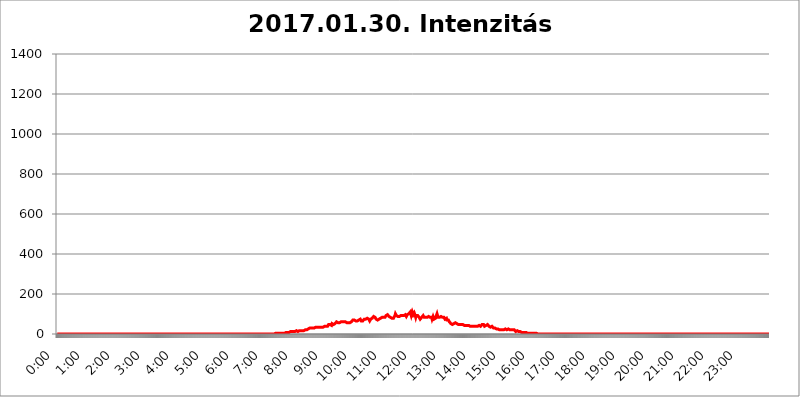
| Category | 2017.01.30. Intenzitás [W/m^2] |
|---|---|
| 0.0 | 0 |
| 0.0006944444444444445 | 0 |
| 0.001388888888888889 | 0 |
| 0.0020833333333333333 | 0 |
| 0.002777777777777778 | 0 |
| 0.003472222222222222 | 0 |
| 0.004166666666666667 | 0 |
| 0.004861111111111111 | 0 |
| 0.005555555555555556 | 0 |
| 0.0062499999999999995 | 0 |
| 0.006944444444444444 | 0 |
| 0.007638888888888889 | 0 |
| 0.008333333333333333 | 0 |
| 0.009027777777777779 | 0 |
| 0.009722222222222222 | 0 |
| 0.010416666666666666 | 0 |
| 0.011111111111111112 | 0 |
| 0.011805555555555555 | 0 |
| 0.012499999999999999 | 0 |
| 0.013194444444444444 | 0 |
| 0.013888888888888888 | 0 |
| 0.014583333333333332 | 0 |
| 0.015277777777777777 | 0 |
| 0.015972222222222224 | 0 |
| 0.016666666666666666 | 0 |
| 0.017361111111111112 | 0 |
| 0.018055555555555557 | 0 |
| 0.01875 | 0 |
| 0.019444444444444445 | 0 |
| 0.02013888888888889 | 0 |
| 0.020833333333333332 | 0 |
| 0.02152777777777778 | 0 |
| 0.022222222222222223 | 0 |
| 0.02291666666666667 | 0 |
| 0.02361111111111111 | 0 |
| 0.024305555555555556 | 0 |
| 0.024999999999999998 | 0 |
| 0.025694444444444447 | 0 |
| 0.02638888888888889 | 0 |
| 0.027083333333333334 | 0 |
| 0.027777777777777776 | 0 |
| 0.02847222222222222 | 0 |
| 0.029166666666666664 | 0 |
| 0.029861111111111113 | 0 |
| 0.030555555555555555 | 0 |
| 0.03125 | 0 |
| 0.03194444444444445 | 0 |
| 0.03263888888888889 | 0 |
| 0.03333333333333333 | 0 |
| 0.034027777777777775 | 0 |
| 0.034722222222222224 | 0 |
| 0.035416666666666666 | 0 |
| 0.036111111111111115 | 0 |
| 0.03680555555555556 | 0 |
| 0.0375 | 0 |
| 0.03819444444444444 | 0 |
| 0.03888888888888889 | 0 |
| 0.03958333333333333 | 0 |
| 0.04027777777777778 | 0 |
| 0.04097222222222222 | 0 |
| 0.041666666666666664 | 0 |
| 0.042361111111111106 | 0 |
| 0.04305555555555556 | 0 |
| 0.043750000000000004 | 0 |
| 0.044444444444444446 | 0 |
| 0.04513888888888889 | 0 |
| 0.04583333333333334 | 0 |
| 0.04652777777777778 | 0 |
| 0.04722222222222222 | 0 |
| 0.04791666666666666 | 0 |
| 0.04861111111111111 | 0 |
| 0.049305555555555554 | 0 |
| 0.049999999999999996 | 0 |
| 0.05069444444444445 | 0 |
| 0.051388888888888894 | 0 |
| 0.052083333333333336 | 0 |
| 0.05277777777777778 | 0 |
| 0.05347222222222222 | 0 |
| 0.05416666666666667 | 0 |
| 0.05486111111111111 | 0 |
| 0.05555555555555555 | 0 |
| 0.05625 | 0 |
| 0.05694444444444444 | 0 |
| 0.057638888888888885 | 0 |
| 0.05833333333333333 | 0 |
| 0.05902777777777778 | 0 |
| 0.059722222222222225 | 0 |
| 0.06041666666666667 | 0 |
| 0.061111111111111116 | 0 |
| 0.06180555555555556 | 0 |
| 0.0625 | 0 |
| 0.06319444444444444 | 0 |
| 0.06388888888888888 | 0 |
| 0.06458333333333334 | 0 |
| 0.06527777777777778 | 0 |
| 0.06597222222222222 | 0 |
| 0.06666666666666667 | 0 |
| 0.06736111111111111 | 0 |
| 0.06805555555555555 | 0 |
| 0.06874999999999999 | 0 |
| 0.06944444444444443 | 0 |
| 0.07013888888888889 | 0 |
| 0.07083333333333333 | 0 |
| 0.07152777777777779 | 0 |
| 0.07222222222222223 | 0 |
| 0.07291666666666667 | 0 |
| 0.07361111111111111 | 0 |
| 0.07430555555555556 | 0 |
| 0.075 | 0 |
| 0.07569444444444444 | 0 |
| 0.0763888888888889 | 0 |
| 0.07708333333333334 | 0 |
| 0.07777777777777778 | 0 |
| 0.07847222222222222 | 0 |
| 0.07916666666666666 | 0 |
| 0.0798611111111111 | 0 |
| 0.08055555555555556 | 0 |
| 0.08125 | 0 |
| 0.08194444444444444 | 0 |
| 0.08263888888888889 | 0 |
| 0.08333333333333333 | 0 |
| 0.08402777777777777 | 0 |
| 0.08472222222222221 | 0 |
| 0.08541666666666665 | 0 |
| 0.08611111111111112 | 0 |
| 0.08680555555555557 | 0 |
| 0.08750000000000001 | 0 |
| 0.08819444444444445 | 0 |
| 0.08888888888888889 | 0 |
| 0.08958333333333333 | 0 |
| 0.09027777777777778 | 0 |
| 0.09097222222222222 | 0 |
| 0.09166666666666667 | 0 |
| 0.09236111111111112 | 0 |
| 0.09305555555555556 | 0 |
| 0.09375 | 0 |
| 0.09444444444444444 | 0 |
| 0.09513888888888888 | 0 |
| 0.09583333333333333 | 0 |
| 0.09652777777777777 | 0 |
| 0.09722222222222222 | 0 |
| 0.09791666666666667 | 0 |
| 0.09861111111111111 | 0 |
| 0.09930555555555555 | 0 |
| 0.09999999999999999 | 0 |
| 0.10069444444444443 | 0 |
| 0.1013888888888889 | 0 |
| 0.10208333333333335 | 0 |
| 0.10277777777777779 | 0 |
| 0.10347222222222223 | 0 |
| 0.10416666666666667 | 0 |
| 0.10486111111111111 | 0 |
| 0.10555555555555556 | 0 |
| 0.10625 | 0 |
| 0.10694444444444444 | 0 |
| 0.1076388888888889 | 0 |
| 0.10833333333333334 | 0 |
| 0.10902777777777778 | 0 |
| 0.10972222222222222 | 0 |
| 0.1111111111111111 | 0 |
| 0.11180555555555556 | 0 |
| 0.11180555555555556 | 0 |
| 0.1125 | 0 |
| 0.11319444444444444 | 0 |
| 0.11388888888888889 | 0 |
| 0.11458333333333333 | 0 |
| 0.11527777777777777 | 0 |
| 0.11597222222222221 | 0 |
| 0.11666666666666665 | 0 |
| 0.1173611111111111 | 0 |
| 0.11805555555555557 | 0 |
| 0.11944444444444445 | 0 |
| 0.12013888888888889 | 0 |
| 0.12083333333333333 | 0 |
| 0.12152777777777778 | 0 |
| 0.12222222222222223 | 0 |
| 0.12291666666666667 | 0 |
| 0.12291666666666667 | 0 |
| 0.12361111111111112 | 0 |
| 0.12430555555555556 | 0 |
| 0.125 | 0 |
| 0.12569444444444444 | 0 |
| 0.12638888888888888 | 0 |
| 0.12708333333333333 | 0 |
| 0.16875 | 0 |
| 0.12847222222222224 | 0 |
| 0.12916666666666668 | 0 |
| 0.12986111111111112 | 0 |
| 0.13055555555555556 | 0 |
| 0.13125 | 0 |
| 0.13194444444444445 | 0 |
| 0.1326388888888889 | 0 |
| 0.13333333333333333 | 0 |
| 0.13402777777777777 | 0 |
| 0.13402777777777777 | 0 |
| 0.13472222222222222 | 0 |
| 0.13541666666666666 | 0 |
| 0.1361111111111111 | 0 |
| 0.13749999999999998 | 0 |
| 0.13819444444444443 | 0 |
| 0.1388888888888889 | 0 |
| 0.13958333333333334 | 0 |
| 0.14027777777777778 | 0 |
| 0.14097222222222222 | 0 |
| 0.14166666666666666 | 0 |
| 0.1423611111111111 | 0 |
| 0.14305555555555557 | 0 |
| 0.14375000000000002 | 0 |
| 0.14444444444444446 | 0 |
| 0.1451388888888889 | 0 |
| 0.1451388888888889 | 0 |
| 0.14652777777777778 | 0 |
| 0.14722222222222223 | 0 |
| 0.14791666666666667 | 0 |
| 0.1486111111111111 | 0 |
| 0.14930555555555555 | 0 |
| 0.15 | 0 |
| 0.15069444444444444 | 0 |
| 0.15138888888888888 | 0 |
| 0.15208333333333332 | 0 |
| 0.15277777777777776 | 0 |
| 0.15347222222222223 | 0 |
| 0.15416666666666667 | 0 |
| 0.15486111111111112 | 0 |
| 0.15555555555555556 | 0 |
| 0.15625 | 0 |
| 0.15694444444444444 | 0 |
| 0.15763888888888888 | 0 |
| 0.15833333333333333 | 0 |
| 0.15902777777777777 | 0 |
| 0.15972222222222224 | 0 |
| 0.16041666666666668 | 0 |
| 0.16111111111111112 | 0 |
| 0.16180555555555556 | 0 |
| 0.1625 | 0 |
| 0.16319444444444445 | 0 |
| 0.1638888888888889 | 0 |
| 0.16458333333333333 | 0 |
| 0.16527777777777777 | 0 |
| 0.16597222222222222 | 0 |
| 0.16666666666666666 | 0 |
| 0.1673611111111111 | 0 |
| 0.16805555555555554 | 0 |
| 0.16874999999999998 | 0 |
| 0.16944444444444443 | 0 |
| 0.17013888888888887 | 0 |
| 0.1708333333333333 | 0 |
| 0.17152777777777775 | 0 |
| 0.17222222222222225 | 0 |
| 0.1729166666666667 | 0 |
| 0.17361111111111113 | 0 |
| 0.17430555555555557 | 0 |
| 0.17500000000000002 | 0 |
| 0.17569444444444446 | 0 |
| 0.1763888888888889 | 0 |
| 0.17708333333333334 | 0 |
| 0.17777777777777778 | 0 |
| 0.17847222222222223 | 0 |
| 0.17916666666666667 | 0 |
| 0.1798611111111111 | 0 |
| 0.18055555555555555 | 0 |
| 0.18125 | 0 |
| 0.18194444444444444 | 0 |
| 0.1826388888888889 | 0 |
| 0.18333333333333335 | 0 |
| 0.1840277777777778 | 0 |
| 0.18472222222222223 | 0 |
| 0.18541666666666667 | 0 |
| 0.18611111111111112 | 0 |
| 0.18680555555555556 | 0 |
| 0.1875 | 0 |
| 0.18819444444444444 | 0 |
| 0.18888888888888888 | 0 |
| 0.18958333333333333 | 0 |
| 0.19027777777777777 | 0 |
| 0.1909722222222222 | 0 |
| 0.19166666666666665 | 0 |
| 0.19236111111111112 | 0 |
| 0.19305555555555554 | 0 |
| 0.19375 | 0 |
| 0.19444444444444445 | 0 |
| 0.1951388888888889 | 0 |
| 0.19583333333333333 | 0 |
| 0.19652777777777777 | 0 |
| 0.19722222222222222 | 0 |
| 0.19791666666666666 | 0 |
| 0.1986111111111111 | 0 |
| 0.19930555555555554 | 0 |
| 0.19999999999999998 | 0 |
| 0.20069444444444443 | 0 |
| 0.20138888888888887 | 0 |
| 0.2020833333333333 | 0 |
| 0.2027777777777778 | 0 |
| 0.2034722222222222 | 0 |
| 0.2041666666666667 | 0 |
| 0.20486111111111113 | 0 |
| 0.20555555555555557 | 0 |
| 0.20625000000000002 | 0 |
| 0.20694444444444446 | 0 |
| 0.2076388888888889 | 0 |
| 0.20833333333333334 | 0 |
| 0.20902777777777778 | 0 |
| 0.20972222222222223 | 0 |
| 0.21041666666666667 | 0 |
| 0.2111111111111111 | 0 |
| 0.21180555555555555 | 0 |
| 0.2125 | 0 |
| 0.21319444444444444 | 0 |
| 0.2138888888888889 | 0 |
| 0.21458333333333335 | 0 |
| 0.2152777777777778 | 0 |
| 0.21597222222222223 | 0 |
| 0.21666666666666667 | 0 |
| 0.21736111111111112 | 0 |
| 0.21805555555555556 | 0 |
| 0.21875 | 0 |
| 0.21944444444444444 | 0 |
| 0.22013888888888888 | 0 |
| 0.22083333333333333 | 0 |
| 0.22152777777777777 | 0 |
| 0.2222222222222222 | 0 |
| 0.22291666666666665 | 0 |
| 0.2236111111111111 | 0 |
| 0.22430555555555556 | 0 |
| 0.225 | 0 |
| 0.22569444444444445 | 0 |
| 0.2263888888888889 | 0 |
| 0.22708333333333333 | 0 |
| 0.22777777777777777 | 0 |
| 0.22847222222222222 | 0 |
| 0.22916666666666666 | 0 |
| 0.2298611111111111 | 0 |
| 0.23055555555555554 | 0 |
| 0.23124999999999998 | 0 |
| 0.23194444444444443 | 0 |
| 0.23263888888888887 | 0 |
| 0.2333333333333333 | 0 |
| 0.2340277777777778 | 0 |
| 0.2347222222222222 | 0 |
| 0.2354166666666667 | 0 |
| 0.23611111111111113 | 0 |
| 0.23680555555555557 | 0 |
| 0.23750000000000002 | 0 |
| 0.23819444444444446 | 0 |
| 0.2388888888888889 | 0 |
| 0.23958333333333334 | 0 |
| 0.24027777777777778 | 0 |
| 0.24097222222222223 | 0 |
| 0.24166666666666667 | 0 |
| 0.2423611111111111 | 0 |
| 0.24305555555555555 | 0 |
| 0.24375 | 0 |
| 0.24444444444444446 | 0 |
| 0.24513888888888888 | 0 |
| 0.24583333333333335 | 0 |
| 0.2465277777777778 | 0 |
| 0.24722222222222223 | 0 |
| 0.24791666666666667 | 0 |
| 0.24861111111111112 | 0 |
| 0.24930555555555556 | 0 |
| 0.25 | 0 |
| 0.25069444444444444 | 0 |
| 0.2513888888888889 | 0 |
| 0.2520833333333333 | 0 |
| 0.25277777777777777 | 0 |
| 0.2534722222222222 | 0 |
| 0.25416666666666665 | 0 |
| 0.2548611111111111 | 0 |
| 0.2555555555555556 | 0 |
| 0.25625000000000003 | 0 |
| 0.2569444444444445 | 0 |
| 0.2576388888888889 | 0 |
| 0.25833333333333336 | 0 |
| 0.2590277777777778 | 0 |
| 0.25972222222222224 | 0 |
| 0.2604166666666667 | 0 |
| 0.2611111111111111 | 0 |
| 0.26180555555555557 | 0 |
| 0.2625 | 0 |
| 0.26319444444444445 | 0 |
| 0.2638888888888889 | 0 |
| 0.26458333333333334 | 0 |
| 0.2652777777777778 | 0 |
| 0.2659722222222222 | 0 |
| 0.26666666666666666 | 0 |
| 0.2673611111111111 | 0 |
| 0.26805555555555555 | 0 |
| 0.26875 | 0 |
| 0.26944444444444443 | 0 |
| 0.2701388888888889 | 0 |
| 0.2708333333333333 | 0 |
| 0.27152777777777776 | 0 |
| 0.2722222222222222 | 0 |
| 0.27291666666666664 | 0 |
| 0.2736111111111111 | 0 |
| 0.2743055555555555 | 0 |
| 0.27499999999999997 | 0 |
| 0.27569444444444446 | 0 |
| 0.27638888888888885 | 0 |
| 0.27708333333333335 | 0 |
| 0.2777777777777778 | 0 |
| 0.27847222222222223 | 0 |
| 0.2791666666666667 | 0 |
| 0.2798611111111111 | 0 |
| 0.28055555555555556 | 0 |
| 0.28125 | 0 |
| 0.28194444444444444 | 0 |
| 0.2826388888888889 | 0 |
| 0.2833333333333333 | 0 |
| 0.28402777777777777 | 0 |
| 0.2847222222222222 | 0 |
| 0.28541666666666665 | 0 |
| 0.28611111111111115 | 0 |
| 0.28680555555555554 | 0 |
| 0.28750000000000003 | 0 |
| 0.2881944444444445 | 0 |
| 0.2888888888888889 | 0 |
| 0.28958333333333336 | 0 |
| 0.2902777777777778 | 0 |
| 0.29097222222222224 | 0 |
| 0.2916666666666667 | 0 |
| 0.2923611111111111 | 0 |
| 0.29305555555555557 | 0 |
| 0.29375 | 0 |
| 0.29444444444444445 | 0 |
| 0.2951388888888889 | 0 |
| 0.29583333333333334 | 0 |
| 0.2965277777777778 | 0 |
| 0.2972222222222222 | 0 |
| 0.29791666666666666 | 0 |
| 0.2986111111111111 | 0 |
| 0.29930555555555555 | 0 |
| 0.3 | 0 |
| 0.30069444444444443 | 0 |
| 0.3013888888888889 | 0 |
| 0.3020833333333333 | 0 |
| 0.30277777777777776 | 0 |
| 0.3034722222222222 | 0 |
| 0.30416666666666664 | 0 |
| 0.3048611111111111 | 0 |
| 0.3055555555555555 | 0 |
| 0.30624999999999997 | 3.525 |
| 0.3069444444444444 | 3.525 |
| 0.3076388888888889 | 3.525 |
| 0.30833333333333335 | 3.525 |
| 0.3090277777777778 | 3.525 |
| 0.30972222222222223 | 3.525 |
| 0.3104166666666667 | 3.525 |
| 0.3111111111111111 | 3.525 |
| 0.31180555555555556 | 3.525 |
| 0.3125 | 3.525 |
| 0.31319444444444444 | 3.525 |
| 0.3138888888888889 | 3.525 |
| 0.3145833333333333 | 3.525 |
| 0.31527777777777777 | 3.525 |
| 0.3159722222222222 | 3.525 |
| 0.31666666666666665 | 3.525 |
| 0.31736111111111115 | 3.525 |
| 0.31805555555555554 | 7.887 |
| 0.31875000000000003 | 3.525 |
| 0.3194444444444445 | 3.525 |
| 0.3201388888888889 | 7.887 |
| 0.32083333333333336 | 7.887 |
| 0.3215277777777778 | 7.887 |
| 0.32222222222222224 | 7.887 |
| 0.3229166666666667 | 7.887 |
| 0.3236111111111111 | 7.887 |
| 0.32430555555555557 | 7.887 |
| 0.325 | 7.887 |
| 0.32569444444444445 | 7.887 |
| 0.3263888888888889 | 12.257 |
| 0.32708333333333334 | 12.257 |
| 0.3277777777777778 | 12.257 |
| 0.3284722222222222 | 12.257 |
| 0.32916666666666666 | 12.257 |
| 0.3298611111111111 | 12.257 |
| 0.33055555555555555 | 12.257 |
| 0.33125 | 12.257 |
| 0.33194444444444443 | 12.257 |
| 0.3326388888888889 | 12.257 |
| 0.3333333333333333 | 12.257 |
| 0.3340277777777778 | 12.257 |
| 0.3347222222222222 | 12.257 |
| 0.3354166666666667 | 16.636 |
| 0.3361111111111111 | 16.636 |
| 0.3368055555555556 | 16.636 |
| 0.33749999999999997 | 12.257 |
| 0.33819444444444446 | 16.636 |
| 0.33888888888888885 | 16.636 |
| 0.33958333333333335 | 16.636 |
| 0.34027777777777773 | 16.636 |
| 0.34097222222222223 | 16.636 |
| 0.3416666666666666 | 16.636 |
| 0.3423611111111111 | 16.636 |
| 0.3430555555555555 | 16.636 |
| 0.34375 | 16.636 |
| 0.3444444444444445 | 16.636 |
| 0.3451388888888889 | 16.636 |
| 0.3458333333333334 | 16.636 |
| 0.34652777777777777 | 21.024 |
| 0.34722222222222227 | 16.636 |
| 0.34791666666666665 | 21.024 |
| 0.34861111111111115 | 21.024 |
| 0.34930555555555554 | 21.024 |
| 0.35000000000000003 | 21.024 |
| 0.3506944444444444 | 25.419 |
| 0.3513888888888889 | 25.419 |
| 0.3520833333333333 | 25.419 |
| 0.3527777777777778 | 25.419 |
| 0.3534722222222222 | 29.823 |
| 0.3541666666666667 | 29.823 |
| 0.3548611111111111 | 29.823 |
| 0.35555555555555557 | 29.823 |
| 0.35625 | 29.823 |
| 0.35694444444444445 | 29.823 |
| 0.3576388888888889 | 29.823 |
| 0.35833333333333334 | 29.823 |
| 0.3590277777777778 | 29.823 |
| 0.3597222222222222 | 29.823 |
| 0.36041666666666666 | 29.823 |
| 0.3611111111111111 | 29.823 |
| 0.36180555555555555 | 29.823 |
| 0.3625 | 34.234 |
| 0.36319444444444443 | 29.823 |
| 0.3638888888888889 | 29.823 |
| 0.3645833333333333 | 34.234 |
| 0.3652777777777778 | 34.234 |
| 0.3659722222222222 | 34.234 |
| 0.3666666666666667 | 34.234 |
| 0.3673611111111111 | 34.234 |
| 0.3680555555555556 | 34.234 |
| 0.36874999999999997 | 34.234 |
| 0.36944444444444446 | 34.234 |
| 0.37013888888888885 | 34.234 |
| 0.37083333333333335 | 34.234 |
| 0.37152777777777773 | 34.234 |
| 0.37222222222222223 | 34.234 |
| 0.3729166666666666 | 34.234 |
| 0.3736111111111111 | 34.234 |
| 0.3743055555555555 | 38.653 |
| 0.375 | 38.653 |
| 0.3756944444444445 | 38.653 |
| 0.3763888888888889 | 38.653 |
| 0.3770833333333334 | 38.653 |
| 0.37777777777777777 | 38.653 |
| 0.37847222222222227 | 38.653 |
| 0.37916666666666665 | 38.653 |
| 0.37986111111111115 | 43.079 |
| 0.38055555555555554 | 47.511 |
| 0.38125000000000003 | 43.079 |
| 0.3819444444444444 | 47.511 |
| 0.3826388888888889 | 47.511 |
| 0.3833333333333333 | 43.079 |
| 0.3840277777777778 | 43.079 |
| 0.3847222222222222 | 43.079 |
| 0.3854166666666667 | 51.951 |
| 0.3861111111111111 | 51.951 |
| 0.38680555555555557 | 47.511 |
| 0.3875 | 47.511 |
| 0.38819444444444445 | 47.511 |
| 0.3888888888888889 | 51.951 |
| 0.38958333333333334 | 51.951 |
| 0.3902777777777778 | 56.398 |
| 0.3909722222222222 | 56.398 |
| 0.39166666666666666 | 60.85 |
| 0.3923611111111111 | 60.85 |
| 0.39305555555555555 | 60.85 |
| 0.39375 | 56.398 |
| 0.39444444444444443 | 56.398 |
| 0.3951388888888889 | 60.85 |
| 0.3958333333333333 | 56.398 |
| 0.3965277777777778 | 56.398 |
| 0.3972222222222222 | 56.398 |
| 0.3979166666666667 | 60.85 |
| 0.3986111111111111 | 60.85 |
| 0.3993055555555556 | 60.85 |
| 0.39999999999999997 | 60.85 |
| 0.40069444444444446 | 60.85 |
| 0.40138888888888885 | 60.85 |
| 0.40208333333333335 | 60.85 |
| 0.40277777777777773 | 60.85 |
| 0.40347222222222223 | 60.85 |
| 0.4041666666666666 | 60.85 |
| 0.4048611111111111 | 60.85 |
| 0.4055555555555555 | 56.398 |
| 0.40625 | 56.398 |
| 0.4069444444444445 | 56.398 |
| 0.4076388888888889 | 56.398 |
| 0.4083333333333334 | 56.398 |
| 0.40902777777777777 | 60.85 |
| 0.40972222222222227 | 56.398 |
| 0.41041666666666665 | 56.398 |
| 0.41111111111111115 | 60.85 |
| 0.41180555555555554 | 60.85 |
| 0.41250000000000003 | 60.85 |
| 0.4131944444444444 | 60.85 |
| 0.4138888888888889 | 65.31 |
| 0.4145833333333333 | 69.775 |
| 0.4152777777777778 | 74.246 |
| 0.4159722222222222 | 74.246 |
| 0.4166666666666667 | 69.775 |
| 0.4173611111111111 | 69.775 |
| 0.41805555555555557 | 65.31 |
| 0.41875 | 65.31 |
| 0.41944444444444445 | 60.85 |
| 0.4201388888888889 | 60.85 |
| 0.42083333333333334 | 65.31 |
| 0.4215277777777778 | 65.31 |
| 0.4222222222222222 | 65.31 |
| 0.42291666666666666 | 69.775 |
| 0.4236111111111111 | 69.775 |
| 0.42430555555555555 | 74.246 |
| 0.425 | 74.246 |
| 0.42569444444444443 | 74.246 |
| 0.4263888888888889 | 65.31 |
| 0.4270833333333333 | 65.31 |
| 0.4277777777777778 | 65.31 |
| 0.4284722222222222 | 65.31 |
| 0.4291666666666667 | 65.31 |
| 0.4298611111111111 | 69.775 |
| 0.4305555555555556 | 74.246 |
| 0.43124999999999997 | 69.775 |
| 0.43194444444444446 | 74.246 |
| 0.43263888888888885 | 74.246 |
| 0.43333333333333335 | 78.722 |
| 0.43402777777777773 | 78.722 |
| 0.43472222222222223 | 78.722 |
| 0.4354166666666666 | 78.722 |
| 0.4361111111111111 | 78.722 |
| 0.4368055555555555 | 74.246 |
| 0.4375 | 69.775 |
| 0.4381944444444445 | 65.31 |
| 0.4388888888888889 | 69.775 |
| 0.4395833333333334 | 74.246 |
| 0.44027777777777777 | 78.722 |
| 0.44097222222222227 | 78.722 |
| 0.44166666666666665 | 78.722 |
| 0.44236111111111115 | 78.722 |
| 0.44305555555555554 | 83.205 |
| 0.44375000000000003 | 87.692 |
| 0.4444444444444444 | 83.205 |
| 0.4451388888888889 | 83.205 |
| 0.4458333333333333 | 83.205 |
| 0.4465277777777778 | 78.722 |
| 0.4472222222222222 | 74.246 |
| 0.4479166666666667 | 74.246 |
| 0.4486111111111111 | 69.775 |
| 0.44930555555555557 | 69.775 |
| 0.45 | 69.775 |
| 0.45069444444444445 | 69.775 |
| 0.4513888888888889 | 74.246 |
| 0.45208333333333334 | 74.246 |
| 0.4527777777777778 | 74.246 |
| 0.4534722222222222 | 78.722 |
| 0.45416666666666666 | 83.205 |
| 0.4548611111111111 | 83.205 |
| 0.45555555555555555 | 83.205 |
| 0.45625 | 87.692 |
| 0.45694444444444443 | 83.205 |
| 0.4576388888888889 | 83.205 |
| 0.4583333333333333 | 83.205 |
| 0.4590277777777778 | 83.205 |
| 0.4597222222222222 | 83.205 |
| 0.4604166666666667 | 83.205 |
| 0.4611111111111111 | 92.184 |
| 0.4618055555555556 | 87.692 |
| 0.46249999999999997 | 92.184 |
| 0.46319444444444446 | 96.682 |
| 0.46388888888888885 | 92.184 |
| 0.46458333333333335 | 92.184 |
| 0.46527777777777773 | 87.692 |
| 0.46597222222222223 | 83.205 |
| 0.4666666666666666 | 83.205 |
| 0.4673611111111111 | 83.205 |
| 0.4680555555555555 | 78.722 |
| 0.46875 | 78.722 |
| 0.4694444444444445 | 78.722 |
| 0.4701388888888889 | 83.205 |
| 0.4708333333333334 | 83.205 |
| 0.47152777777777777 | 78.722 |
| 0.47222222222222227 | 78.722 |
| 0.47291666666666665 | 83.205 |
| 0.47361111111111115 | 92.184 |
| 0.47430555555555554 | 101.184 |
| 0.47500000000000003 | 96.682 |
| 0.4756944444444444 | 92.184 |
| 0.4763888888888889 | 92.184 |
| 0.4770833333333333 | 87.692 |
| 0.4777777777777778 | 87.692 |
| 0.4784722222222222 | 83.205 |
| 0.4791666666666667 | 83.205 |
| 0.4798611111111111 | 87.692 |
| 0.48055555555555557 | 83.205 |
| 0.48125 | 92.184 |
| 0.48194444444444445 | 92.184 |
| 0.4826388888888889 | 92.184 |
| 0.48333333333333334 | 96.682 |
| 0.4840277777777778 | 92.184 |
| 0.4847222222222222 | 92.184 |
| 0.48541666666666666 | 96.682 |
| 0.4861111111111111 | 92.184 |
| 0.48680555555555555 | 92.184 |
| 0.4875 | 92.184 |
| 0.48819444444444443 | 96.682 |
| 0.4888888888888889 | 92.184 |
| 0.4895833333333333 | 87.692 |
| 0.4902777777777778 | 92.184 |
| 0.4909722222222222 | 96.682 |
| 0.4916666666666667 | 96.682 |
| 0.4923611111111111 | 101.184 |
| 0.4930555555555556 | 101.184 |
| 0.49374999999999997 | 96.682 |
| 0.49444444444444446 | 101.184 |
| 0.49513888888888885 | 110.201 |
| 0.49583333333333335 | 101.184 |
| 0.49652777777777773 | 92.184 |
| 0.49722222222222223 | 101.184 |
| 0.4979166666666666 | 110.201 |
| 0.4986111111111111 | 105.69 |
| 0.4993055555555555 | 96.682 |
| 0.5 | 101.184 |
| 0.5006944444444444 | 105.69 |
| 0.5013888888888889 | 101.184 |
| 0.5020833333333333 | 92.184 |
| 0.5027777777777778 | 83.205 |
| 0.5034722222222222 | 92.184 |
| 0.5041666666666667 | 92.184 |
| 0.5048611111111111 | 87.692 |
| 0.5055555555555555 | 92.184 |
| 0.50625 | 96.682 |
| 0.5069444444444444 | 92.184 |
| 0.5076388888888889 | 83.205 |
| 0.5083333333333333 | 83.205 |
| 0.5090277777777777 | 74.246 |
| 0.5097222222222222 | 74.246 |
| 0.5104166666666666 | 78.722 |
| 0.5111111111111112 | 83.205 |
| 0.5118055555555555 | 87.692 |
| 0.5125000000000001 | 87.692 |
| 0.5131944444444444 | 92.184 |
| 0.513888888888889 | 87.692 |
| 0.5145833333333333 | 83.205 |
| 0.5152777777777778 | 83.205 |
| 0.5159722222222222 | 78.722 |
| 0.5166666666666667 | 83.205 |
| 0.517361111111111 | 83.205 |
| 0.5180555555555556 | 78.722 |
| 0.5187499999999999 | 83.205 |
| 0.5194444444444445 | 83.205 |
| 0.5201388888888888 | 83.205 |
| 0.5208333333333334 | 87.692 |
| 0.5215277777777778 | 92.184 |
| 0.5222222222222223 | 92.184 |
| 0.5229166666666667 | 83.205 |
| 0.5236111111111111 | 87.692 |
| 0.5243055555555556 | 87.692 |
| 0.525 | 83.205 |
| 0.5256944444444445 | 74.246 |
| 0.5263888888888889 | 78.722 |
| 0.5270833333333333 | 87.692 |
| 0.5277777777777778 | 83.205 |
| 0.5284722222222222 | 74.246 |
| 0.5291666666666667 | 69.775 |
| 0.5298611111111111 | 69.775 |
| 0.5305555555555556 | 78.722 |
| 0.53125 | 87.692 |
| 0.5319444444444444 | 92.184 |
| 0.5326388888888889 | 101.184 |
| 0.5333333333333333 | 96.682 |
| 0.5340277777777778 | 83.205 |
| 0.5347222222222222 | 83.205 |
| 0.5354166666666667 | 78.722 |
| 0.5361111111111111 | 83.205 |
| 0.5368055555555555 | 83.205 |
| 0.5375 | 83.205 |
| 0.5381944444444444 | 87.692 |
| 0.5388888888888889 | 83.205 |
| 0.5395833333333333 | 87.692 |
| 0.5402777777777777 | 83.205 |
| 0.5409722222222222 | 83.205 |
| 0.5416666666666666 | 87.692 |
| 0.5423611111111112 | 83.205 |
| 0.5430555555555555 | 83.205 |
| 0.5437500000000001 | 74.246 |
| 0.5444444444444444 | 74.246 |
| 0.545138888888889 | 78.722 |
| 0.5458333333333333 | 78.722 |
| 0.5465277777777778 | 69.775 |
| 0.5472222222222222 | 65.31 |
| 0.5479166666666667 | 65.31 |
| 0.548611111111111 | 69.775 |
| 0.5493055555555556 | 65.31 |
| 0.5499999999999999 | 60.85 |
| 0.5506944444444445 | 60.85 |
| 0.5513888888888888 | 56.398 |
| 0.5520833333333334 | 51.951 |
| 0.5527777777777778 | 51.951 |
| 0.5534722222222223 | 47.511 |
| 0.5541666666666667 | 47.511 |
| 0.5548611111111111 | 51.951 |
| 0.5555555555555556 | 51.951 |
| 0.55625 | 51.951 |
| 0.5569444444444445 | 47.511 |
| 0.5576388888888889 | 51.951 |
| 0.5583333333333333 | 56.398 |
| 0.5590277777777778 | 56.398 |
| 0.5597222222222222 | 51.951 |
| 0.5604166666666667 | 51.951 |
| 0.5611111111111111 | 47.511 |
| 0.5618055555555556 | 47.511 |
| 0.5625 | 47.511 |
| 0.5631944444444444 | 47.511 |
| 0.5638888888888889 | 47.511 |
| 0.5645833333333333 | 47.511 |
| 0.5652777777777778 | 47.511 |
| 0.5659722222222222 | 47.511 |
| 0.5666666666666667 | 47.511 |
| 0.5673611111111111 | 47.511 |
| 0.5680555555555555 | 47.511 |
| 0.56875 | 47.511 |
| 0.5694444444444444 | 47.511 |
| 0.5701388888888889 | 47.511 |
| 0.5708333333333333 | 43.079 |
| 0.5715277777777777 | 47.511 |
| 0.5722222222222222 | 47.511 |
| 0.5729166666666666 | 43.079 |
| 0.5736111111111112 | 43.079 |
| 0.5743055555555555 | 43.079 |
| 0.5750000000000001 | 43.079 |
| 0.5756944444444444 | 43.079 |
| 0.576388888888889 | 47.511 |
| 0.5770833333333333 | 43.079 |
| 0.5777777777777778 | 43.079 |
| 0.5784722222222222 | 43.079 |
| 0.5791666666666667 | 38.653 |
| 0.579861111111111 | 43.079 |
| 0.5805555555555556 | 43.079 |
| 0.5812499999999999 | 38.653 |
| 0.5819444444444445 | 38.653 |
| 0.5826388888888888 | 38.653 |
| 0.5833333333333334 | 38.653 |
| 0.5840277777777778 | 38.653 |
| 0.5847222222222223 | 38.653 |
| 0.5854166666666667 | 38.653 |
| 0.5861111111111111 | 38.653 |
| 0.5868055555555556 | 43.079 |
| 0.5875 | 38.653 |
| 0.5881944444444445 | 38.653 |
| 0.5888888888888889 | 38.653 |
| 0.5895833333333333 | 38.653 |
| 0.5902777777777778 | 38.653 |
| 0.5909722222222222 | 38.653 |
| 0.5916666666666667 | 43.079 |
| 0.5923611111111111 | 38.653 |
| 0.5930555555555556 | 38.653 |
| 0.59375 | 38.653 |
| 0.5944444444444444 | 38.653 |
| 0.5951388888888889 | 43.079 |
| 0.5958333333333333 | 47.511 |
| 0.5965277777777778 | 43.079 |
| 0.5972222222222222 | 43.079 |
| 0.5979166666666667 | 47.511 |
| 0.5986111111111111 | 43.079 |
| 0.5993055555555555 | 38.653 |
| 0.6 | 38.653 |
| 0.6006944444444444 | 38.653 |
| 0.6013888888888889 | 43.079 |
| 0.6020833333333333 | 43.079 |
| 0.6027777777777777 | 47.511 |
| 0.6034722222222222 | 47.511 |
| 0.6041666666666666 | 43.079 |
| 0.6048611111111112 | 43.079 |
| 0.6055555555555555 | 38.653 |
| 0.6062500000000001 | 38.653 |
| 0.6069444444444444 | 38.653 |
| 0.607638888888889 | 34.234 |
| 0.6083333333333333 | 34.234 |
| 0.6090277777777778 | 34.234 |
| 0.6097222222222222 | 38.653 |
| 0.6104166666666667 | 34.234 |
| 0.611111111111111 | 34.234 |
| 0.6118055555555556 | 29.823 |
| 0.6124999999999999 | 34.234 |
| 0.6131944444444445 | 29.823 |
| 0.6138888888888888 | 29.823 |
| 0.6145833333333334 | 29.823 |
| 0.6152777777777778 | 25.419 |
| 0.6159722222222223 | 25.419 |
| 0.6166666666666667 | 25.419 |
| 0.6173611111111111 | 25.419 |
| 0.6180555555555556 | 25.419 |
| 0.61875 | 25.419 |
| 0.6194444444444445 | 25.419 |
| 0.6201388888888889 | 21.024 |
| 0.6208333333333333 | 25.419 |
| 0.6215277777777778 | 21.024 |
| 0.6222222222222222 | 21.024 |
| 0.6229166666666667 | 21.024 |
| 0.6236111111111111 | 21.024 |
| 0.6243055555555556 | 21.024 |
| 0.625 | 21.024 |
| 0.6256944444444444 | 21.024 |
| 0.6263888888888889 | 21.024 |
| 0.6270833333333333 | 21.024 |
| 0.6277777777777778 | 25.419 |
| 0.6284722222222222 | 25.419 |
| 0.6291666666666667 | 25.419 |
| 0.6298611111111111 | 25.419 |
| 0.6305555555555555 | 21.024 |
| 0.63125 | 25.419 |
| 0.6319444444444444 | 25.419 |
| 0.6326388888888889 | 25.419 |
| 0.6333333333333333 | 25.419 |
| 0.6340277777777777 | 21.024 |
| 0.6347222222222222 | 21.024 |
| 0.6354166666666666 | 21.024 |
| 0.6361111111111112 | 21.024 |
| 0.6368055555555555 | 21.024 |
| 0.6375000000000001 | 21.024 |
| 0.6381944444444444 | 21.024 |
| 0.638888888888889 | 21.024 |
| 0.6395833333333333 | 21.024 |
| 0.6402777777777778 | 21.024 |
| 0.6409722222222222 | 21.024 |
| 0.6416666666666667 | 16.636 |
| 0.642361111111111 | 16.636 |
| 0.6430555555555556 | 12.257 |
| 0.6437499999999999 | 12.257 |
| 0.6444444444444445 | 16.636 |
| 0.6451388888888888 | 16.636 |
| 0.6458333333333334 | 16.636 |
| 0.6465277777777778 | 16.636 |
| 0.6472222222222223 | 12.257 |
| 0.6479166666666667 | 12.257 |
| 0.6486111111111111 | 12.257 |
| 0.6493055555555556 | 12.257 |
| 0.65 | 12.257 |
| 0.6506944444444445 | 7.887 |
| 0.6513888888888889 | 7.887 |
| 0.6520833333333333 | 7.887 |
| 0.6527777777777778 | 7.887 |
| 0.6534722222222222 | 7.887 |
| 0.6541666666666667 | 7.887 |
| 0.6548611111111111 | 7.887 |
| 0.6555555555555556 | 7.887 |
| 0.65625 | 7.887 |
| 0.6569444444444444 | 7.887 |
| 0.6576388888888889 | 7.887 |
| 0.6583333333333333 | 7.887 |
| 0.6590277777777778 | 7.887 |
| 0.6597222222222222 | 3.525 |
| 0.6604166666666667 | 3.525 |
| 0.6611111111111111 | 3.525 |
| 0.6618055555555555 | 3.525 |
| 0.6625 | 3.525 |
| 0.6631944444444444 | 3.525 |
| 0.6638888888888889 | 3.525 |
| 0.6645833333333333 | 3.525 |
| 0.6652777777777777 | 3.525 |
| 0.6659722222222222 | 3.525 |
| 0.6666666666666666 | 3.525 |
| 0.6673611111111111 | 3.525 |
| 0.6680555555555556 | 3.525 |
| 0.6687500000000001 | 3.525 |
| 0.6694444444444444 | 3.525 |
| 0.6701388888888888 | 3.525 |
| 0.6708333333333334 | 3.525 |
| 0.6715277777777778 | 3.525 |
| 0.6722222222222222 | 3.525 |
| 0.6729166666666666 | 3.525 |
| 0.6736111111111112 | 0 |
| 0.6743055555555556 | 0 |
| 0.6749999999999999 | 0 |
| 0.6756944444444444 | 0 |
| 0.6763888888888889 | 0 |
| 0.6770833333333334 | 0 |
| 0.6777777777777777 | 0 |
| 0.6784722222222223 | 0 |
| 0.6791666666666667 | 0 |
| 0.6798611111111111 | 0 |
| 0.6805555555555555 | 0 |
| 0.68125 | 0 |
| 0.6819444444444445 | 0 |
| 0.6826388888888889 | 0 |
| 0.6833333333333332 | 0 |
| 0.6840277777777778 | 0 |
| 0.6847222222222222 | 0 |
| 0.6854166666666667 | 0 |
| 0.686111111111111 | 0 |
| 0.6868055555555556 | 0 |
| 0.6875 | 0 |
| 0.6881944444444444 | 0 |
| 0.688888888888889 | 0 |
| 0.6895833333333333 | 0 |
| 0.6902777777777778 | 0 |
| 0.6909722222222222 | 0 |
| 0.6916666666666668 | 0 |
| 0.6923611111111111 | 0 |
| 0.6930555555555555 | 0 |
| 0.69375 | 0 |
| 0.6944444444444445 | 0 |
| 0.6951388888888889 | 0 |
| 0.6958333333333333 | 0 |
| 0.6965277777777777 | 0 |
| 0.6972222222222223 | 0 |
| 0.6979166666666666 | 0 |
| 0.6986111111111111 | 0 |
| 0.6993055555555556 | 0 |
| 0.7000000000000001 | 0 |
| 0.7006944444444444 | 0 |
| 0.7013888888888888 | 0 |
| 0.7020833333333334 | 0 |
| 0.7027777777777778 | 0 |
| 0.7034722222222222 | 0 |
| 0.7041666666666666 | 0 |
| 0.7048611111111112 | 0 |
| 0.7055555555555556 | 0 |
| 0.7062499999999999 | 0 |
| 0.7069444444444444 | 0 |
| 0.7076388888888889 | 0 |
| 0.7083333333333334 | 0 |
| 0.7090277777777777 | 0 |
| 0.7097222222222223 | 0 |
| 0.7104166666666667 | 0 |
| 0.7111111111111111 | 0 |
| 0.7118055555555555 | 0 |
| 0.7125 | 0 |
| 0.7131944444444445 | 0 |
| 0.7138888888888889 | 0 |
| 0.7145833333333332 | 0 |
| 0.7152777777777778 | 0 |
| 0.7159722222222222 | 0 |
| 0.7166666666666667 | 0 |
| 0.717361111111111 | 0 |
| 0.7180555555555556 | 0 |
| 0.71875 | 0 |
| 0.7194444444444444 | 0 |
| 0.720138888888889 | 0 |
| 0.7208333333333333 | 0 |
| 0.7215277777777778 | 0 |
| 0.7222222222222222 | 0 |
| 0.7229166666666668 | 0 |
| 0.7236111111111111 | 0 |
| 0.7243055555555555 | 0 |
| 0.725 | 0 |
| 0.7256944444444445 | 0 |
| 0.7263888888888889 | 0 |
| 0.7270833333333333 | 0 |
| 0.7277777777777777 | 0 |
| 0.7284722222222223 | 0 |
| 0.7291666666666666 | 0 |
| 0.7298611111111111 | 0 |
| 0.7305555555555556 | 0 |
| 0.7312500000000001 | 0 |
| 0.7319444444444444 | 0 |
| 0.7326388888888888 | 0 |
| 0.7333333333333334 | 0 |
| 0.7340277777777778 | 0 |
| 0.7347222222222222 | 0 |
| 0.7354166666666666 | 0 |
| 0.7361111111111112 | 0 |
| 0.7368055555555556 | 0 |
| 0.7374999999999999 | 0 |
| 0.7381944444444444 | 0 |
| 0.7388888888888889 | 0 |
| 0.7395833333333334 | 0 |
| 0.7402777777777777 | 0 |
| 0.7409722222222223 | 0 |
| 0.7416666666666667 | 0 |
| 0.7423611111111111 | 0 |
| 0.7430555555555555 | 0 |
| 0.74375 | 0 |
| 0.7444444444444445 | 0 |
| 0.7451388888888889 | 0 |
| 0.7458333333333332 | 0 |
| 0.7465277777777778 | 0 |
| 0.7472222222222222 | 0 |
| 0.7479166666666667 | 0 |
| 0.748611111111111 | 0 |
| 0.7493055555555556 | 0 |
| 0.75 | 0 |
| 0.7506944444444444 | 0 |
| 0.751388888888889 | 0 |
| 0.7520833333333333 | 0 |
| 0.7527777777777778 | 0 |
| 0.7534722222222222 | 0 |
| 0.7541666666666668 | 0 |
| 0.7548611111111111 | 0 |
| 0.7555555555555555 | 0 |
| 0.75625 | 0 |
| 0.7569444444444445 | 0 |
| 0.7576388888888889 | 0 |
| 0.7583333333333333 | 0 |
| 0.7590277777777777 | 0 |
| 0.7597222222222223 | 0 |
| 0.7604166666666666 | 0 |
| 0.7611111111111111 | 0 |
| 0.7618055555555556 | 0 |
| 0.7625000000000001 | 0 |
| 0.7631944444444444 | 0 |
| 0.7638888888888888 | 0 |
| 0.7645833333333334 | 0 |
| 0.7652777777777778 | 0 |
| 0.7659722222222222 | 0 |
| 0.7666666666666666 | 0 |
| 0.7673611111111112 | 0 |
| 0.7680555555555556 | 0 |
| 0.7687499999999999 | 0 |
| 0.7694444444444444 | 0 |
| 0.7701388888888889 | 0 |
| 0.7708333333333334 | 0 |
| 0.7715277777777777 | 0 |
| 0.7722222222222223 | 0 |
| 0.7729166666666667 | 0 |
| 0.7736111111111111 | 0 |
| 0.7743055555555555 | 0 |
| 0.775 | 0 |
| 0.7756944444444445 | 0 |
| 0.7763888888888889 | 0 |
| 0.7770833333333332 | 0 |
| 0.7777777777777778 | 0 |
| 0.7784722222222222 | 0 |
| 0.7791666666666667 | 0 |
| 0.779861111111111 | 0 |
| 0.7805555555555556 | 0 |
| 0.78125 | 0 |
| 0.7819444444444444 | 0 |
| 0.782638888888889 | 0 |
| 0.7833333333333333 | 0 |
| 0.7840277777777778 | 0 |
| 0.7847222222222222 | 0 |
| 0.7854166666666668 | 0 |
| 0.7861111111111111 | 0 |
| 0.7868055555555555 | 0 |
| 0.7875 | 0 |
| 0.7881944444444445 | 0 |
| 0.7888888888888889 | 0 |
| 0.7895833333333333 | 0 |
| 0.7902777777777777 | 0 |
| 0.7909722222222223 | 0 |
| 0.7916666666666666 | 0 |
| 0.7923611111111111 | 0 |
| 0.7930555555555556 | 0 |
| 0.7937500000000001 | 0 |
| 0.7944444444444444 | 0 |
| 0.7951388888888888 | 0 |
| 0.7958333333333334 | 0 |
| 0.7965277777777778 | 0 |
| 0.7972222222222222 | 0 |
| 0.7979166666666666 | 0 |
| 0.7986111111111112 | 0 |
| 0.7993055555555556 | 0 |
| 0.7999999999999999 | 0 |
| 0.8006944444444444 | 0 |
| 0.8013888888888889 | 0 |
| 0.8020833333333334 | 0 |
| 0.8027777777777777 | 0 |
| 0.8034722222222223 | 0 |
| 0.8041666666666667 | 0 |
| 0.8048611111111111 | 0 |
| 0.8055555555555555 | 0 |
| 0.80625 | 0 |
| 0.8069444444444445 | 0 |
| 0.8076388888888889 | 0 |
| 0.8083333333333332 | 0 |
| 0.8090277777777778 | 0 |
| 0.8097222222222222 | 0 |
| 0.8104166666666667 | 0 |
| 0.811111111111111 | 0 |
| 0.8118055555555556 | 0 |
| 0.8125 | 0 |
| 0.8131944444444444 | 0 |
| 0.813888888888889 | 0 |
| 0.8145833333333333 | 0 |
| 0.8152777777777778 | 0 |
| 0.8159722222222222 | 0 |
| 0.8166666666666668 | 0 |
| 0.8173611111111111 | 0 |
| 0.8180555555555555 | 0 |
| 0.81875 | 0 |
| 0.8194444444444445 | 0 |
| 0.8201388888888889 | 0 |
| 0.8208333333333333 | 0 |
| 0.8215277777777777 | 0 |
| 0.8222222222222223 | 0 |
| 0.8229166666666666 | 0 |
| 0.8236111111111111 | 0 |
| 0.8243055555555556 | 0 |
| 0.8250000000000001 | 0 |
| 0.8256944444444444 | 0 |
| 0.8263888888888888 | 0 |
| 0.8270833333333334 | 0 |
| 0.8277777777777778 | 0 |
| 0.8284722222222222 | 0 |
| 0.8291666666666666 | 0 |
| 0.8298611111111112 | 0 |
| 0.8305555555555556 | 0 |
| 0.8312499999999999 | 0 |
| 0.8319444444444444 | 0 |
| 0.8326388888888889 | 0 |
| 0.8333333333333334 | 0 |
| 0.8340277777777777 | 0 |
| 0.8347222222222223 | 0 |
| 0.8354166666666667 | 0 |
| 0.8361111111111111 | 0 |
| 0.8368055555555555 | 0 |
| 0.8375 | 0 |
| 0.8381944444444445 | 0 |
| 0.8388888888888889 | 0 |
| 0.8395833333333332 | 0 |
| 0.8402777777777778 | 0 |
| 0.8409722222222222 | 0 |
| 0.8416666666666667 | 0 |
| 0.842361111111111 | 0 |
| 0.8430555555555556 | 0 |
| 0.84375 | 0 |
| 0.8444444444444444 | 0 |
| 0.845138888888889 | 0 |
| 0.8458333333333333 | 0 |
| 0.8465277777777778 | 0 |
| 0.8472222222222222 | 0 |
| 0.8479166666666668 | 0 |
| 0.8486111111111111 | 0 |
| 0.8493055555555555 | 0 |
| 0.85 | 0 |
| 0.8506944444444445 | 0 |
| 0.8513888888888889 | 0 |
| 0.8520833333333333 | 0 |
| 0.8527777777777777 | 0 |
| 0.8534722222222223 | 0 |
| 0.8541666666666666 | 0 |
| 0.8548611111111111 | 0 |
| 0.8555555555555556 | 0 |
| 0.8562500000000001 | 0 |
| 0.8569444444444444 | 0 |
| 0.8576388888888888 | 0 |
| 0.8583333333333334 | 0 |
| 0.8590277777777778 | 0 |
| 0.8597222222222222 | 0 |
| 0.8604166666666666 | 0 |
| 0.8611111111111112 | 0 |
| 0.8618055555555556 | 0 |
| 0.8624999999999999 | 0 |
| 0.8631944444444444 | 0 |
| 0.8638888888888889 | 0 |
| 0.8645833333333334 | 0 |
| 0.8652777777777777 | 0 |
| 0.8659722222222223 | 0 |
| 0.8666666666666667 | 0 |
| 0.8673611111111111 | 0 |
| 0.8680555555555555 | 0 |
| 0.86875 | 0 |
| 0.8694444444444445 | 0 |
| 0.8701388888888889 | 0 |
| 0.8708333333333332 | 0 |
| 0.8715277777777778 | 0 |
| 0.8722222222222222 | 0 |
| 0.8729166666666667 | 0 |
| 0.873611111111111 | 0 |
| 0.8743055555555556 | 0 |
| 0.875 | 0 |
| 0.8756944444444444 | 0 |
| 0.876388888888889 | 0 |
| 0.8770833333333333 | 0 |
| 0.8777777777777778 | 0 |
| 0.8784722222222222 | 0 |
| 0.8791666666666668 | 0 |
| 0.8798611111111111 | 0 |
| 0.8805555555555555 | 0 |
| 0.88125 | 0 |
| 0.8819444444444445 | 0 |
| 0.8826388888888889 | 0 |
| 0.8833333333333333 | 0 |
| 0.8840277777777777 | 0 |
| 0.8847222222222223 | 0 |
| 0.8854166666666666 | 0 |
| 0.8861111111111111 | 0 |
| 0.8868055555555556 | 0 |
| 0.8875000000000001 | 0 |
| 0.8881944444444444 | 0 |
| 0.8888888888888888 | 0 |
| 0.8895833333333334 | 0 |
| 0.8902777777777778 | 0 |
| 0.8909722222222222 | 0 |
| 0.8916666666666666 | 0 |
| 0.8923611111111112 | 0 |
| 0.8930555555555556 | 0 |
| 0.8937499999999999 | 0 |
| 0.8944444444444444 | 0 |
| 0.8951388888888889 | 0 |
| 0.8958333333333334 | 0 |
| 0.8965277777777777 | 0 |
| 0.8972222222222223 | 0 |
| 0.8979166666666667 | 0 |
| 0.8986111111111111 | 0 |
| 0.8993055555555555 | 0 |
| 0.9 | 0 |
| 0.9006944444444445 | 0 |
| 0.9013888888888889 | 0 |
| 0.9020833333333332 | 0 |
| 0.9027777777777778 | 0 |
| 0.9034722222222222 | 0 |
| 0.9041666666666667 | 0 |
| 0.904861111111111 | 0 |
| 0.9055555555555556 | 0 |
| 0.90625 | 0 |
| 0.9069444444444444 | 0 |
| 0.907638888888889 | 0 |
| 0.9083333333333333 | 0 |
| 0.9090277777777778 | 0 |
| 0.9097222222222222 | 0 |
| 0.9104166666666668 | 0 |
| 0.9111111111111111 | 0 |
| 0.9118055555555555 | 0 |
| 0.9125 | 0 |
| 0.9131944444444445 | 0 |
| 0.9138888888888889 | 0 |
| 0.9145833333333333 | 0 |
| 0.9152777777777777 | 0 |
| 0.9159722222222223 | 0 |
| 0.9166666666666666 | 0 |
| 0.9173611111111111 | 0 |
| 0.9180555555555556 | 0 |
| 0.9187500000000001 | 0 |
| 0.9194444444444444 | 0 |
| 0.9201388888888888 | 0 |
| 0.9208333333333334 | 0 |
| 0.9215277777777778 | 0 |
| 0.9222222222222222 | 0 |
| 0.9229166666666666 | 0 |
| 0.9236111111111112 | 0 |
| 0.9243055555555556 | 0 |
| 0.9249999999999999 | 0 |
| 0.9256944444444444 | 0 |
| 0.9263888888888889 | 0 |
| 0.9270833333333334 | 0 |
| 0.9277777777777777 | 0 |
| 0.9284722222222223 | 0 |
| 0.9291666666666667 | 0 |
| 0.9298611111111111 | 0 |
| 0.9305555555555555 | 0 |
| 0.93125 | 0 |
| 0.9319444444444445 | 0 |
| 0.9326388888888889 | 0 |
| 0.9333333333333332 | 0 |
| 0.9340277777777778 | 0 |
| 0.9347222222222222 | 0 |
| 0.9354166666666667 | 0 |
| 0.936111111111111 | 0 |
| 0.9368055555555556 | 0 |
| 0.9375 | 0 |
| 0.9381944444444444 | 0 |
| 0.938888888888889 | 0 |
| 0.9395833333333333 | 0 |
| 0.9402777777777778 | 0 |
| 0.9409722222222222 | 0 |
| 0.9416666666666668 | 0 |
| 0.9423611111111111 | 0 |
| 0.9430555555555555 | 0 |
| 0.94375 | 0 |
| 0.9444444444444445 | 0 |
| 0.9451388888888889 | 0 |
| 0.9458333333333333 | 0 |
| 0.9465277777777777 | 0 |
| 0.9472222222222223 | 0 |
| 0.9479166666666666 | 0 |
| 0.9486111111111111 | 0 |
| 0.9493055555555556 | 0 |
| 0.9500000000000001 | 0 |
| 0.9506944444444444 | 0 |
| 0.9513888888888888 | 0 |
| 0.9520833333333334 | 0 |
| 0.9527777777777778 | 0 |
| 0.9534722222222222 | 0 |
| 0.9541666666666666 | 0 |
| 0.9548611111111112 | 0 |
| 0.9555555555555556 | 0 |
| 0.9562499999999999 | 0 |
| 0.9569444444444444 | 0 |
| 0.9576388888888889 | 0 |
| 0.9583333333333334 | 0 |
| 0.9590277777777777 | 0 |
| 0.9597222222222223 | 0 |
| 0.9604166666666667 | 0 |
| 0.9611111111111111 | 0 |
| 0.9618055555555555 | 0 |
| 0.9625 | 0 |
| 0.9631944444444445 | 0 |
| 0.9638888888888889 | 0 |
| 0.9645833333333332 | 0 |
| 0.9652777777777778 | 0 |
| 0.9659722222222222 | 0 |
| 0.9666666666666667 | 0 |
| 0.967361111111111 | 0 |
| 0.9680555555555556 | 0 |
| 0.96875 | 0 |
| 0.9694444444444444 | 0 |
| 0.970138888888889 | 0 |
| 0.9708333333333333 | 0 |
| 0.9715277777777778 | 0 |
| 0.9722222222222222 | 0 |
| 0.9729166666666668 | 0 |
| 0.9736111111111111 | 0 |
| 0.9743055555555555 | 0 |
| 0.975 | 0 |
| 0.9756944444444445 | 0 |
| 0.9763888888888889 | 0 |
| 0.9770833333333333 | 0 |
| 0.9777777777777777 | 0 |
| 0.9784722222222223 | 0 |
| 0.9791666666666666 | 0 |
| 0.9798611111111111 | 0 |
| 0.9805555555555556 | 0 |
| 0.9812500000000001 | 0 |
| 0.9819444444444444 | 0 |
| 0.9826388888888888 | 0 |
| 0.9833333333333334 | 0 |
| 0.9840277777777778 | 0 |
| 0.9847222222222222 | 0 |
| 0.9854166666666666 | 0 |
| 0.9861111111111112 | 0 |
| 0.9868055555555556 | 0 |
| 0.9874999999999999 | 0 |
| 0.9881944444444444 | 0 |
| 0.9888888888888889 | 0 |
| 0.9895833333333334 | 0 |
| 0.9902777777777777 | 0 |
| 0.9909722222222223 | 0 |
| 0.9916666666666667 | 0 |
| 0.9923611111111111 | 0 |
| 0.9930555555555555 | 0 |
| 0.99375 | 0 |
| 0.9944444444444445 | 0 |
| 0.9951388888888889 | 0 |
| 0.9958333333333332 | 0 |
| 0.9965277777777778 | 0 |
| 0.9972222222222222 | 0 |
| 0.9979166666666667 | 0 |
| 0.998611111111111 | 0 |
| 0.9993055555555556 | 0 |